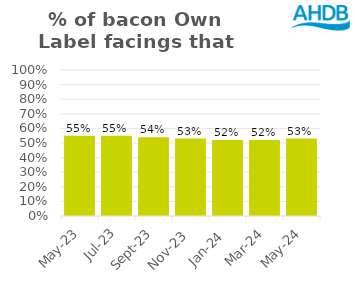
| Category | Bacon |
|---|---|
| 2023-05-01 | 0.55 |
| 2023-07-01 | 0.55 |
| 2023-09-01 | 0.54 |
| 2023-11-01 | 0.53 |
| 2024-01-01 | 0.52 |
| 2024-03-01 | 0.52 |
| 2024-05-01 | 0.53 |